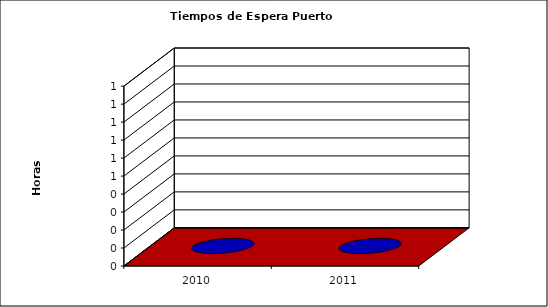
| Category | Series 0 |
|---|---|
| 2010.0 | 0 |
| 2011.0 | 0 |